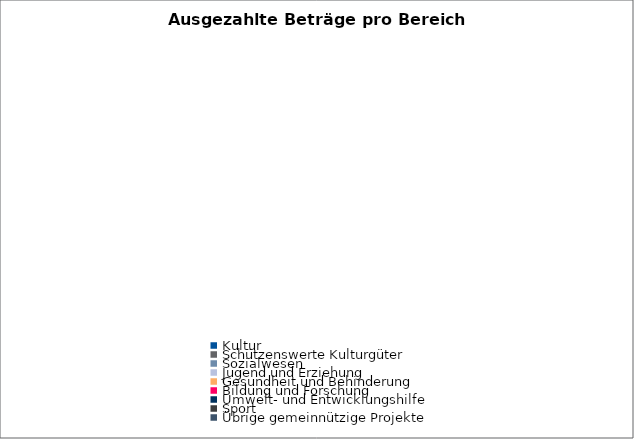
| Category | Series 0 |
|---|---|
| Kultur | 0 |
| Schützenswerte Kulturgüter | 0 |
| Sozialwesen | 0 |
| Jugend und Erziehung | 0 |
| Gesundheit und Behinderung | 0 |
| Bildung und Forschung | 0 |
| Umwelt- und Entwicklungshilfe | 0 |
| Sport | 0 |
| Übrige gemeinnützige Projekte | 0 |